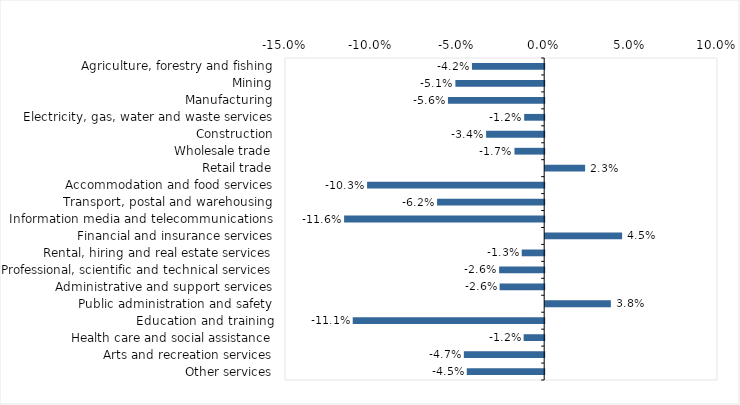
| Category | This week |
|---|---|
| Agriculture, forestry and fishing | -0.042 |
| Mining | -0.051 |
| Manufacturing | -0.056 |
| Electricity, gas, water and waste services | -0.012 |
| Construction | -0.034 |
| Wholesale trade | -0.017 |
| Retail trade | 0.023 |
| Accommodation and food services | -0.102 |
| Transport, postal and warehousing | -0.062 |
| Information media and telecommunications | -0.116 |
| Financial and insurance services | 0.044 |
| Rental, hiring and real estate services | -0.013 |
| Professional, scientific and technical services | -0.026 |
| Administrative and support services | -0.026 |
| Public administration and safety | 0.038 |
| Education and training | -0.111 |
| Health care and social assistance | -0.012 |
| Arts and recreation services | -0.046 |
| Other services | -0.045 |